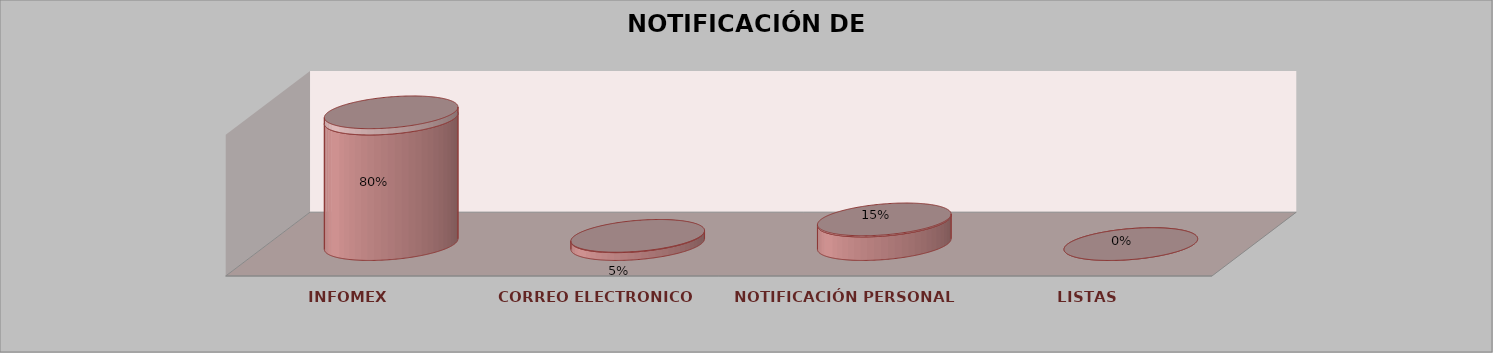
| Category | Series 0 | Series 1 | Series 2 | Series 3 | Series 4 |
|---|---|---|---|---|---|
| INFOMEX |  |  |  | 16 | 0.8 |
| CORREO ELECTRONICO |  |  |  | 1 | 0.05 |
| NOTIFICACIÓN PERSONAL |  |  |  | 3 | 0.15 |
| LISTAS |  |  |  | 0 | 0 |